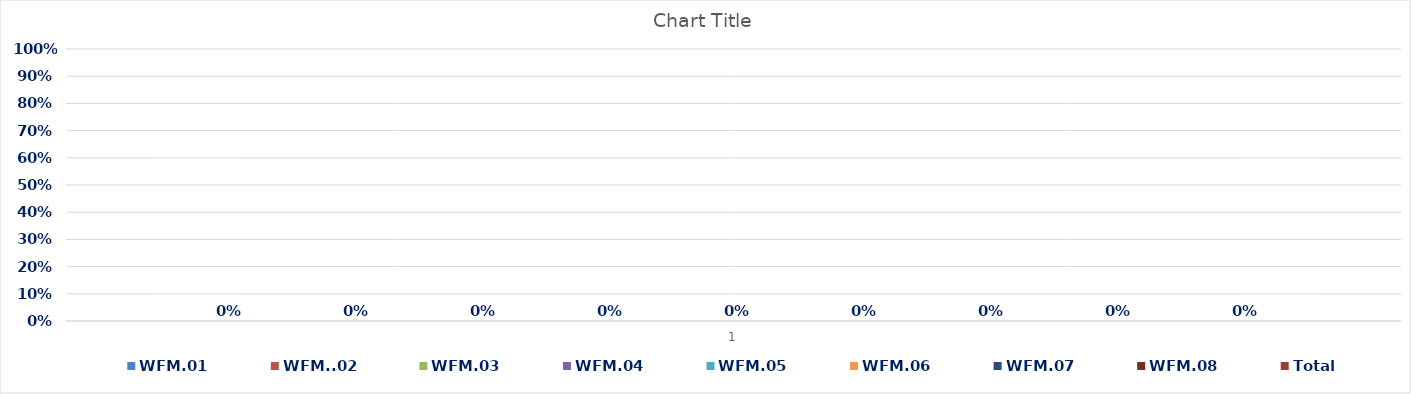
| Category | WFM.01 | WFM..02 | WFM.03 | WFM.04 | WFM.05 | WFM.06 | WFM.07 | WFM.08 | Total |
|---|---|---|---|---|---|---|---|---|---|
| 0 | 0 | 0 | 0 | 0 | 0 | 0 | 0 | 0 | 0 |